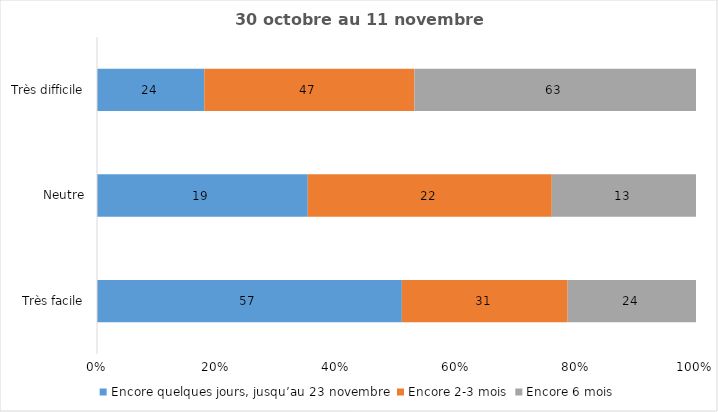
| Category | Encore quelques jours, jusqu’au 23 novembre | Encore 2-3 mois | Encore 6 mois |
|---|---|---|---|
| Très facile | 57 | 31 | 24 |
| Neutre | 19 | 22 | 13 |
| Très difficile | 24 | 47 | 63 |